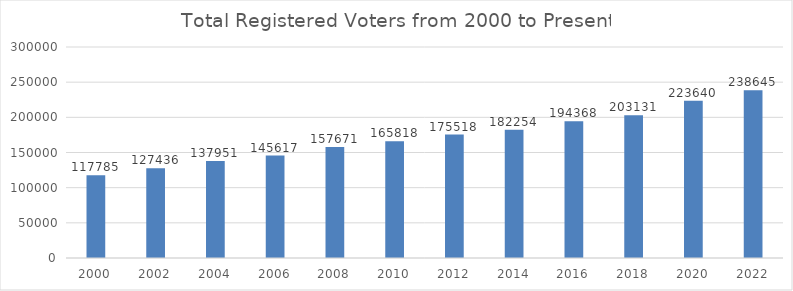
| Category | Series 0 |
|---|---|
| 2000.0 | 117785 |
| 2002.0 | 127436 |
| 2004.0 | 137951 |
| 2006.0 | 145617 |
| 2008.0 | 157671 |
| 2010.0 | 165818 |
| 2012.0 | 175518 |
| 2014.0 | 182254 |
| 2016.0 | 194368 |
| 2018.0 | 203131 |
| 2020.0 | 223640 |
| 2022.0 | 238645 |